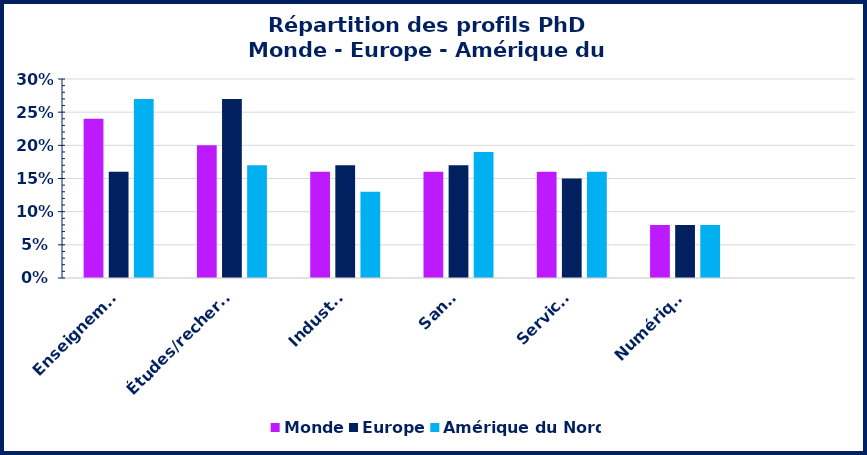
| Category | Monde | Europe | Amérique du Nord |
|---|---|---|---|
| Enseignement | 0.24 | 0.16 | 0.27 |
| Études/recherche | 0.2 | 0.27 | 0.17 |
| Industrie | 0.16 | 0.17 | 0.13 |
| Santé | 0.16 | 0.17 | 0.19 |
| Services | 0.16 | 0.15 | 0.16 |
| Numérique | 0.08 | 0.08 | 0.08 |